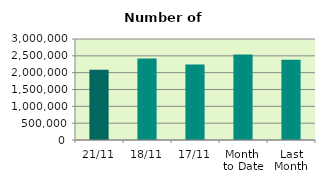
| Category | Series 0 |
|---|---|
| 21/11 | 2083926 |
| 18/11 | 2423006 |
| 17/11 | 2244472 |
| Month 
to Date | 2539281.733 |
| Last
Month | 2382963.143 |